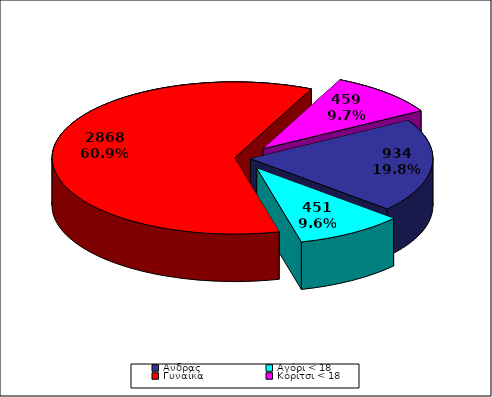
| Category | TOTAL |
|---|---|
| Aνδρας | 934 |
| Αγόρι < 18 | 451 |
| Γυναίκα | 2868 |
| Κορίτσι < 18 | 459 |